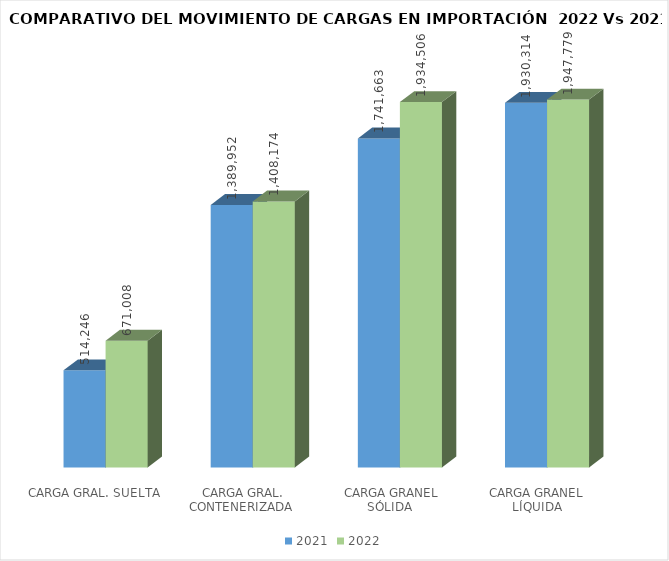
| Category | 2021 | 2022 |
|---|---|---|
|  CARGA GRAL. SUELTA | 514246.37 | 671008 |
|  CARGA GRAL. CONTENERIZADA | 1389952 | 1408174 |
|  CARGA GRANEL SÓLIDA | 1741663.46 | 1934506.38 |
| CARGA GRANEL LÍQUIDA | 1930314 | 1947778.7 |